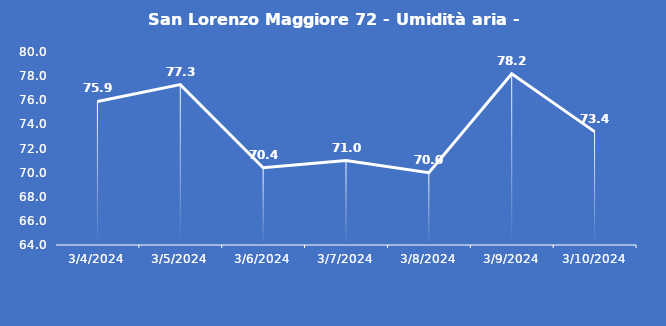
| Category | San Lorenzo Maggiore 72 - Umidità aria - Grezzo (%) |
|---|---|
| 3/4/24 | 75.9 |
| 3/5/24 | 77.3 |
| 3/6/24 | 70.4 |
| 3/7/24 | 71 |
| 3/8/24 | 70 |
| 3/9/24 | 78.2 |
| 3/10/24 | 73.4 |